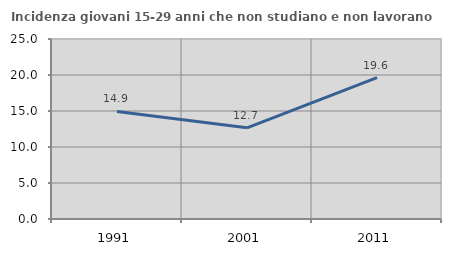
| Category | Incidenza giovani 15-29 anni che non studiano e non lavorano  |
|---|---|
| 1991.0 | 14.937 |
| 2001.0 | 12.666 |
| 2011.0 | 19.635 |